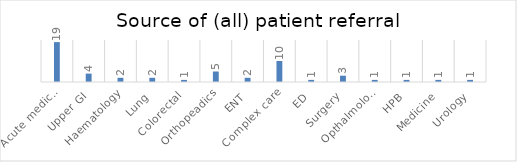
| Category | Series 0 |
|---|---|
| Acute medicine | 19 |
| Upper GI | 4 |
| Haematology | 2 |
| Lung | 2 |
| Colorectal | 1 |
| Orthopeadics | 5 |
| ENT | 2 |
| Complex care | 10 |
| ED | 1 |
| Surgery | 3 |
| Opthalmology | 1 |
| HPB | 1 |
| Medicine | 1 |
| Urology | 1 |